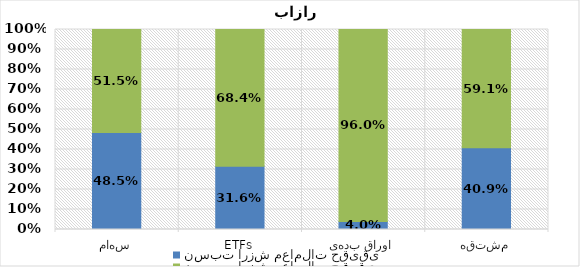
| Category | نسبت ارزش معاملات حقیقی | نسبت ارزش معاملات حقوقی |
|---|---|---|
| سهام | 0.485 | 0.515 |
| ETFs | 0.316 | 0.684 |
| اوراق بدهی | 0.04 | 0.96 |
| مشتقه | 0.409 | 0.591 |